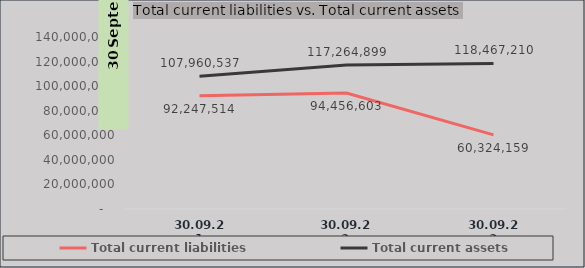
| Category | Total current liabilities | Total current assets |
|---|---|---|
| 30.09.21 | 92247514 | 107960537 |
| 30.09.22 | 94456603 | 117264899 |
| 30.09.22 | 60324159 | 118467210 |